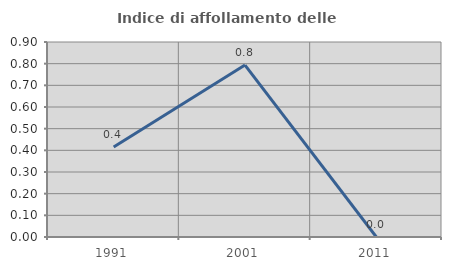
| Category | Indice di affollamento delle abitazioni  |
|---|---|
| 1991.0 | 0.415 |
| 2001.0 | 0.794 |
| 2011.0 | 0 |